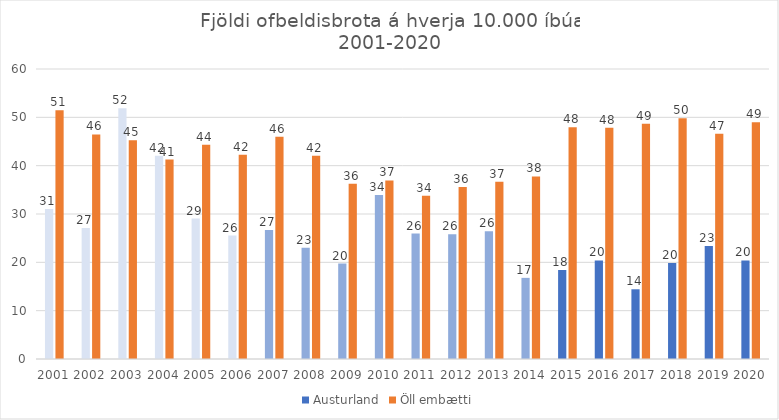
| Category | Austurland | Öll embætti |
|---|---|---|
| 2001.0 | 31.014 | 51.441 |
| 2002.0 | 27.123 | 46.463 |
| 2003.0 | 51.88 | 45.246 |
| 2004.0 | 42.049 | 41.274 |
| 2005.0 | 29.058 | 44.306 |
| 2006.0 | 25.529 | 42.251 |
| 2007.0 | 26.71 | 45.987 |
| 2008.0 | 23.02 | 42.062 |
| 2009.0 | 19.757 | 36.264 |
| 2010.0 | 33.919 | 36.945 |
| 2011.0 | 25.951 | 33.792 |
| 2012.0 | 25.817 | 35.608 |
| 2013.0 | 26.444 | 36.693 |
| 2014.0 | 16.787 | 37.784 |
| 2015.0 | 18.422 | 47.973 |
| 2016.0 | 20.397 | 47.848 |
| 2017.0 | 14.427 | 48.661 |
| 2018.0 | 19.853 | 49.813 |
| 2019.0 | 23.355 | 46.622 |
| 2020.0 | 20.381 | 48.982 |